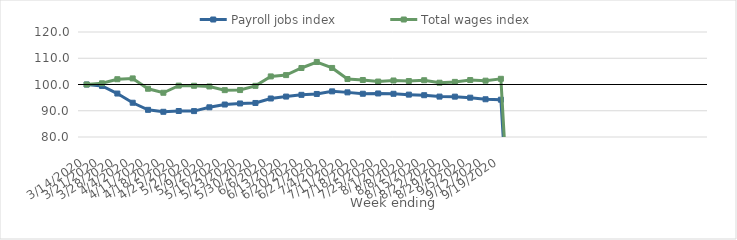
| Category | Payroll jobs index | Total wages index |
|---|---|---|
| 14/03/2020 | 100 | 100 |
| 21/03/2020 | 99.464 | 100.457 |
| 28/03/2020 | 96.558 | 102.016 |
| 04/04/2020 | 93.05 | 102.319 |
| 11/04/2020 | 90.346 | 98.384 |
| 18/04/2020 | 89.602 | 96.852 |
| 25/04/2020 | 89.903 | 99.566 |
| 02/05/2020 | 89.867 | 99.519 |
| 09/05/2020 | 91.312 | 99.25 |
| 16/05/2020 | 92.371 | 97.849 |
| 23/05/2020 | 92.772 | 97.882 |
| 30/05/2020 | 92.963 | 99.486 |
| 06/06/2020 | 94.669 | 103.078 |
| 13/06/2020 | 95.403 | 103.582 |
| 20/06/2020 | 96.061 | 106.29 |
| 27/06/2020 | 96.396 | 108.573 |
| 04/07/2020 | 97.383 | 106.308 |
| 11/07/2020 | 97.001 | 102.088 |
| 18/07/2020 | 96.476 | 101.719 |
| 25/07/2020 | 96.585 | 101.124 |
| 01/08/2020 | 96.464 | 101.525 |
| 08/08/2020 | 96.141 | 101.321 |
| 15/08/2020 | 95.922 | 101.624 |
| 22/08/2020 | 95.389 | 100.682 |
| 29/08/2020 | 95.373 | 100.996 |
| 05/09/2020 | 94.978 | 101.7 |
| 12/09/2020 | 94.381 | 101.453 |
| 19/09/2020 | 94.21 | 102.167 |